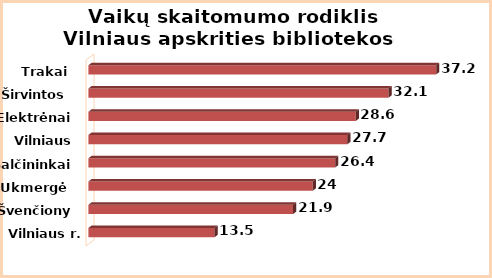
| Category | Series 0 |
|---|---|
| Vilniaus r. | 13.5 |
| Švenčionys | 21.9 |
| Ukmergė | 24 |
| Šalčininkai | 26.4 |
| Vilniaus m. | 27.7 |
| Elektrėnai | 28.6 |
| Širvintos | 32.1 |
| Trakai | 37.2 |